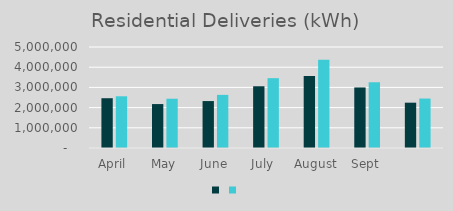
| Category | Series 1 | Series 0 |
|---|---|---|
| April | 2464085 | 2560197 |
| May | 2175066 | 2439036 |
| June | 2323720 | 2629934 |
| July  | 3056084 | 3456641 |
| August | 3564883 | 4364840 |
| Sept | 2997393 | 3255766 |